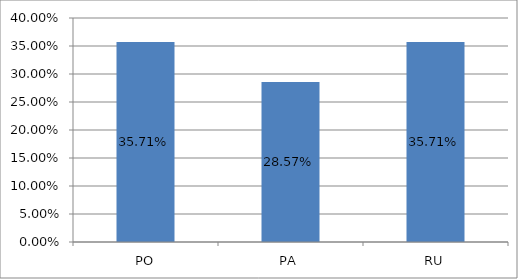
| Category | Series 0 |
|---|---|
| PO | 0.357 |
| PA | 0.286 |
| RU | 0.357 |